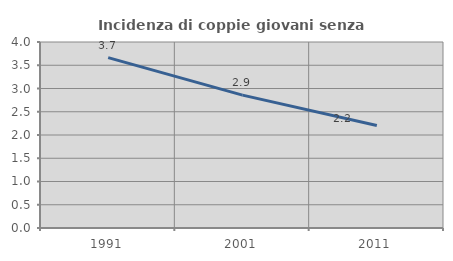
| Category | Incidenza di coppie giovani senza figli |
|---|---|
| 1991.0 | 3.663 |
| 2001.0 | 2.857 |
| 2011.0 | 2.204 |